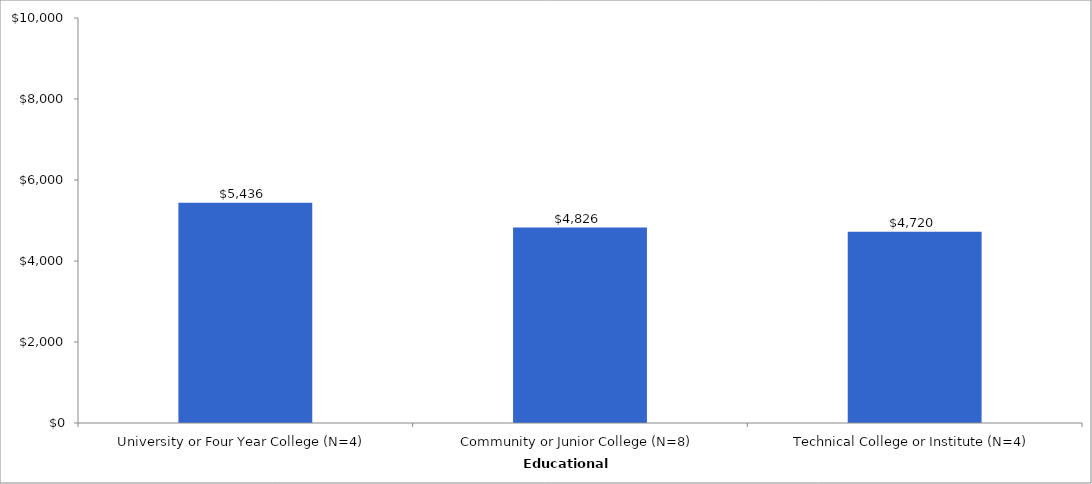
| Category | Series 0 |
|---|---|
| University or Four Year College (N=4) | 5436 |
| Community or Junior College (N=8) | 4826 |
| Technical College or Institute (N=4) | 4720 |